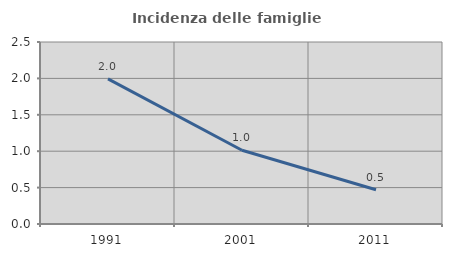
| Category | Incidenza delle famiglie numerose |
|---|---|
| 1991.0 | 1.994 |
| 2001.0 | 1.013 |
| 2011.0 | 0.471 |